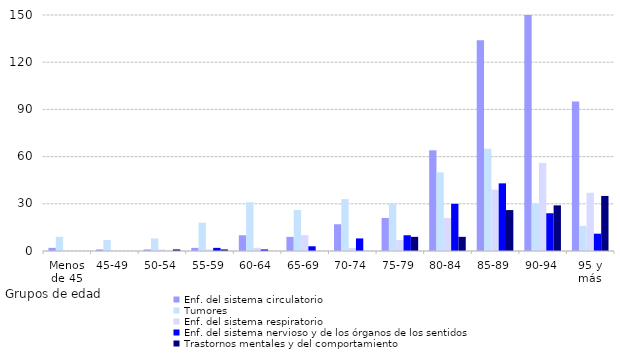
| Category | Enf. del sistema circulatorio | Tumores | Enf. del sistema respiratorio | Enf. del sistema nervioso y de los órganos de los sentidos | Trastornos mentales y del comportamiento |
|---|---|---|---|---|---|
| Menos de 45 | 2 | 9 | 0 | 0 | 0 |
| 45-49 | 1 | 7 | 0 | 0 | 0 |
| 50-54 | 1 | 8 | 1 | 0 | 1 |
| 55-59 | 2 | 18 | 1 | 2 | 1 |
| 60-64 | 10 | 31 | 2 | 1 | 0 |
| 65-69 | 9 | 26 | 10 | 3 | 0 |
| 70-74 | 17 | 33 | 2 | 8 | 0 |
| 75-79 | 21 | 30 | 7 | 10 | 9 |
| 80-84 | 64 | 50 | 21 | 30 | 9 |
| 85-89 | 134 | 65 | 39 | 43 | 26 |
| 90-94 | 160 | 30 | 56 | 24 | 29 |
| 95 y más | 95 | 16 | 37 | 11 | 35 |